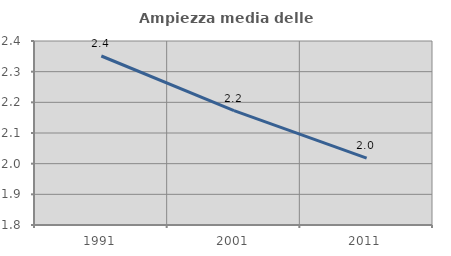
| Category | Ampiezza media delle famiglie |
|---|---|
| 1991.0 | 2.351 |
| 2001.0 | 2.173 |
| 2011.0 | 2.018 |